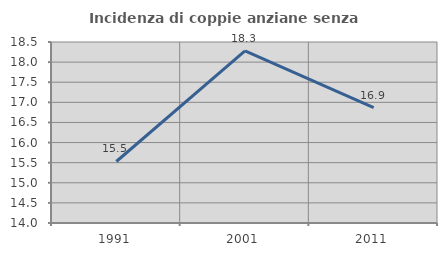
| Category | Incidenza di coppie anziane senza figli  |
|---|---|
| 1991.0 | 15.529 |
| 2001.0 | 18.277 |
| 2011.0 | 16.87 |